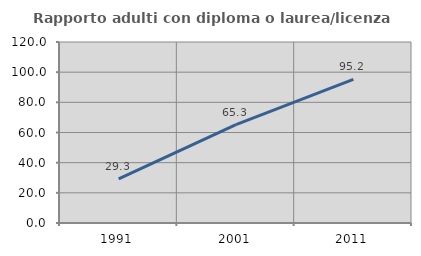
| Category | Rapporto adulti con diploma o laurea/licenza media  |
|---|---|
| 1991.0 | 29.309 |
| 2001.0 | 65.265 |
| 2011.0 | 95.241 |